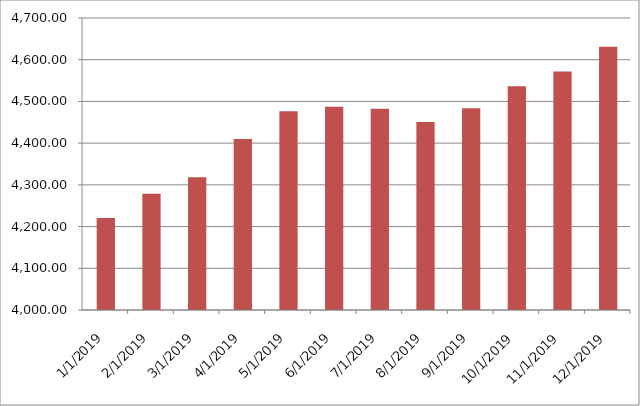
| Category | Series 0 | Series 1 |
|---|---|---|
| 1/1/19 |  | 4220.44 |
| 2/1/19 |  | 4278.86 |
| 3/1/19 |  | 4318.42 |
| 4/1/19 |  | 4410.04 |
| 5/1/19 |  | 4476.6 |
| 6/1/19 |  | 4486.97 |
| 7/1/19 |  | 4482.57 |
| 8/1/19 |  | 4450.86 |
| 9/1/19 |  | 4483.52 |
| 10/1/19 |  | 4536.6 |
| 11/1/19 |  | 4571.97 |
| 12/1/19 |  | 4630.9 |